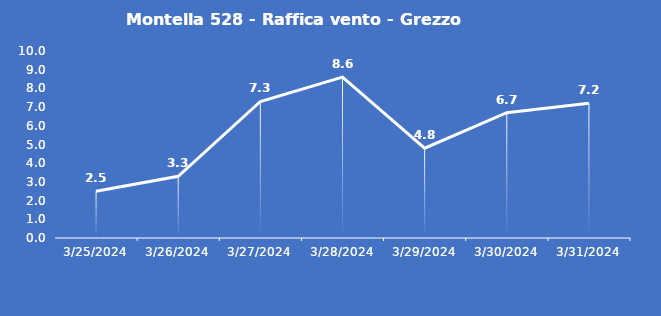
| Category | Montella 528 - Raffica vento - Grezzo (m/s) |
|---|---|
| 3/25/24 | 2.5 |
| 3/26/24 | 3.3 |
| 3/27/24 | 7.3 |
| 3/28/24 | 8.6 |
| 3/29/24 | 4.8 |
| 3/30/24 | 6.7 |
| 3/31/24 | 7.2 |